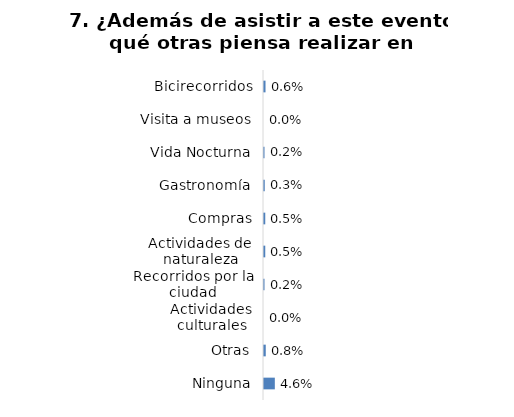
| Category | Series 0 |
|---|---|
| Bicirecorridos | 0.006 |
| Visita a museos | 0 |
| Vida Nocturna | 0.002 |
| Gastronomía | 0.003 |
| Compras | 0.005 |
| Actividades de naturaleza | 0.005 |
| Recorridos por la ciudad | 0.002 |
| Actividades culturales | 0 |
| Otras | 0.008 |
| Ninguna | 0.046 |